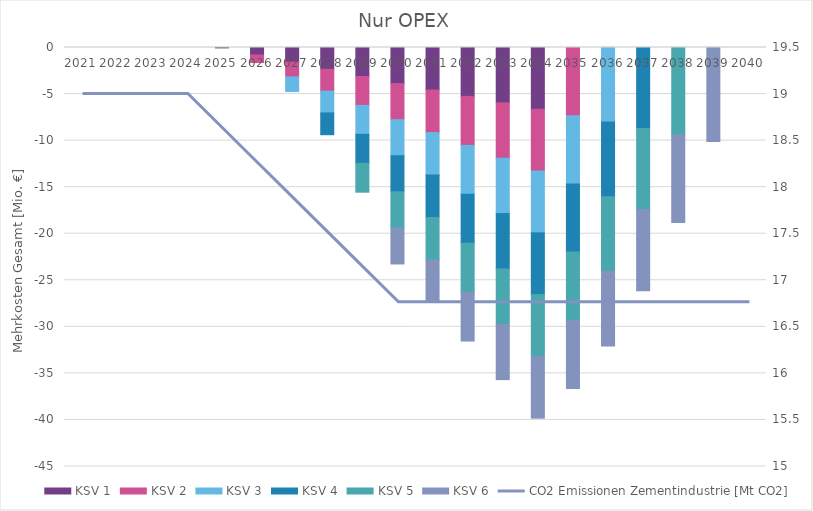
| Category | KSV 1 | KSV 2 | KSV 3 | KSV 4 | KSV 5 | KSV 6 |
|---|---|---|---|---|---|---|
| 0 | 0 | 0 | 0 | 0 | 0 | 0 |
| 1 | 0 | 0 | 0 | 0 | 0 | 0 |
| 2 | 0 | 0 | 0 | 0 | 0 | 0 |
| 3 | 0 | 0 | 0 | 0 | 0 | 0 |
| 4 | -0.042 | 0 | 0 | 0 | 0 | 0 |
| 5 | -0.808 | -0.808 | 0 | 0 | 0 | 0 |
| 6 | -1.575 | -1.575 | -1.575 | 0 | 0 | 0 |
| 7 | -2.342 | -2.342 | -2.342 | -2.342 | 0 | 0 |
| 8 | -3.108 | -3.108 | -3.108 | -3.108 | -3.108 | 0 |
| 9 | -3.875 | -3.875 | -3.875 | -3.875 | -3.875 | -3.875 |
| 10 | -4.565 | -4.565 | -4.565 | -4.565 | -4.565 | -4.565 |
| 11 | -5.255 | -5.255 | -5.255 | -5.255 | -5.255 | -5.255 |
| 12 | -5.945 | -5.945 | -5.945 | -5.945 | -5.945 | -5.945 |
| 13 | -6.635 | -6.635 | -6.635 | -6.635 | -6.635 | -6.635 |
| 14 | 0 | -7.325 | -7.325 | -7.325 | -7.325 | -7.325 |
| 15 | 0 | 0 | -8.014 | -8.014 | -8.014 | -8.014 |
| 16 | 0 | 0 | 0 | -8.704 | -8.704 | -8.704 |
| 17 | 0 | 0 | 0 | 0 | -9.394 | -9.394 |
| 18 | 0 | 0 | 0 | 0 | 0 | -10.084 |
| 19 | 0 | 0 | 0 | 0 | 0 | 0 |